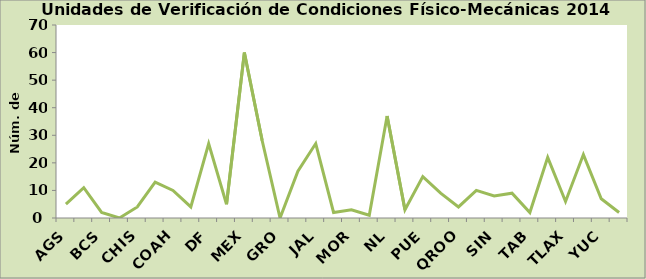
| Category | 3 5 1 1 3 6 4 1 16 |
|---|---|
| AGS | 5 |
| BC | 11 |
| BCS | 2 |
| CAM | 0 |
| CHIS | 4 |
| CHIH | 13 |
| COAH | 10 |
| COL | 4 |
| DF | 27 |
| DGO | 5 |
| MEX | 60 |
| GTO | 28 |
| GRO | 0 |
| HGO | 17 |
| JAL | 27 |
| MICH | 2 |
| MOR | 3 |
| NAY | 1 |
| NL | 37 |
| OAX | 3 |
| PUE | 15 |
| QRO | 9 |
| QROO | 4 |
| SLP | 10 |
| SIN | 8 |
| SON | 9 |
| TAB | 2 |
| TAM | 22 |
| TLAX | 6 |
| VER | 23 |
| YUC | 7 |
| ZAC | 2 |